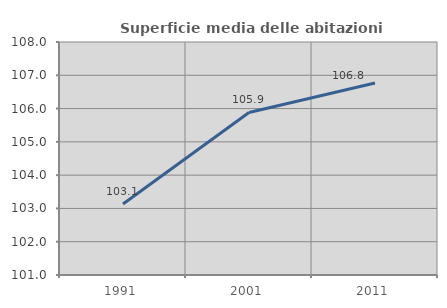
| Category | Superficie media delle abitazioni occupate |
|---|---|
| 1991.0 | 103.135 |
| 2001.0 | 105.883 |
| 2011.0 | 106.767 |